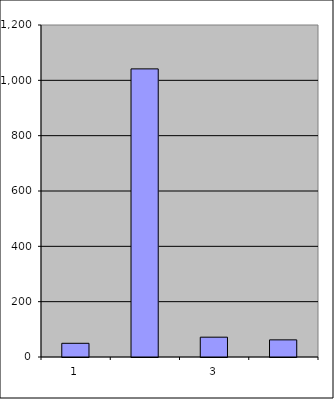
| Category | Series 0 |
|---|---|
| 0 | 49.5 |
| 1 | 1041.4 |
| 2 | 71.657 |
| 3 | 61.944 |